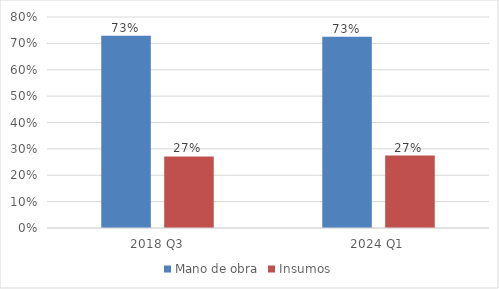
| Category | Mano de obra | Insumos |
|---|---|---|
| 2018 Q3 | 0.728 | 0.272 |
| 2024 Q1 | 0.725 | 0.275 |